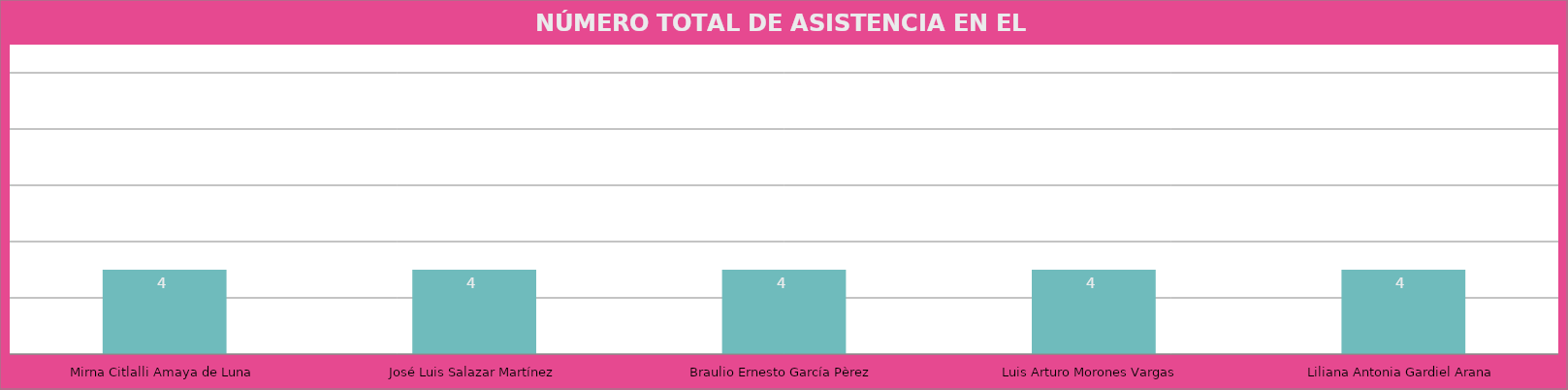
| Category | Mirna Citlalli Amaya de Luna |
|---|---|
| Mirna Citlalli Amaya de Luna | 4 |
| José Luis Salazar Martínez | 4 |
| Braulio Ernesto García Pèrez | 4 |
| Luis Arturo Morones Vargas | 4 |
| Liliana Antonia Gardiel Arana | 4 |